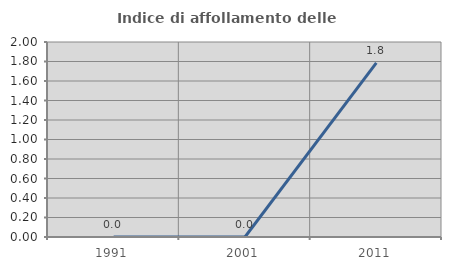
| Category | Indice di affollamento delle abitazioni  |
|---|---|
| 1991.0 | 0 |
| 2001.0 | 0 |
| 2011.0 | 1.786 |